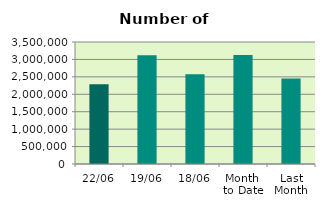
| Category | Series 0 |
|---|---|
| 22/06 | 2288620 |
| 19/06 | 3121774 |
| 18/06 | 2574628 |
| Month 
to Date | 3127105.75 |
| Last
Month | 2451339.2 |